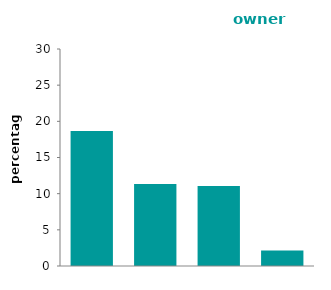
| Category | owner occupied |
|---|---|
| non decent | 18.671 |
| HHSRS | 11.319 |
| serious 
disrepair | 11.07 |
| dampness | 2.154 |